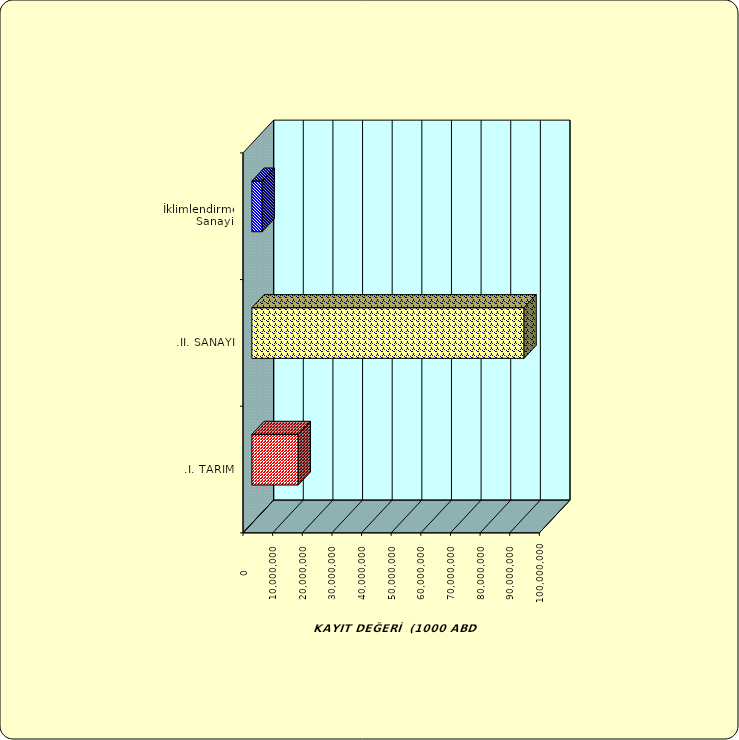
| Category | Series 0 |
|---|---|
| .I. TARIM | 15641770.242 |
| .II. SANAYİ | 91830843.015 |
|  İklimlendirme Sanayii | 3479662.982 |